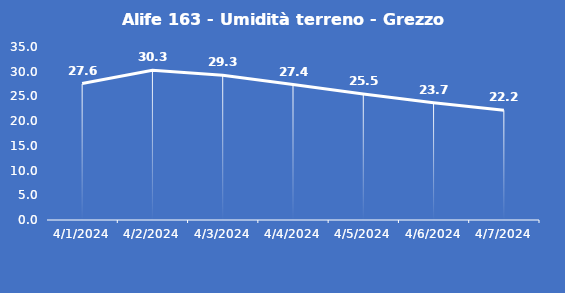
| Category | Alife 163 - Umidità terreno - Grezzo (%VWC) |
|---|---|
| 4/1/24 | 27.6 |
| 4/2/24 | 30.3 |
| 4/3/24 | 29.3 |
| 4/4/24 | 27.4 |
| 4/5/24 | 25.5 |
| 4/6/24 | 23.7 |
| 4/7/24 | 22.2 |